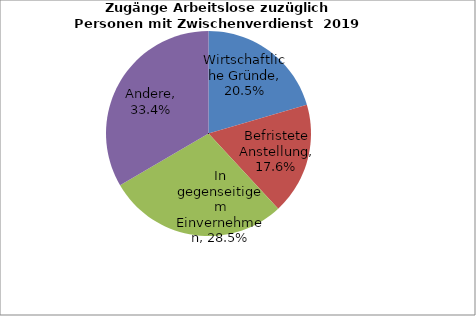
| Category | Series 0 |
|---|---|
| Wirtschaftliche Gründe | 0.205 |
| Befristete Anstellung | 0.176 |
| In gegenseitigem Einvernehmen | 0.285 |
| Andere | 0.334 |